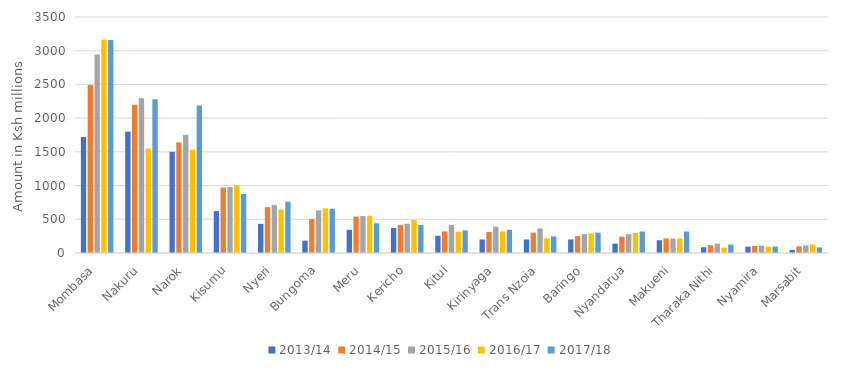
| Category | 2013/14 | 2014/15 | 2015/16 | 2016/17 | 2017/18  |
|---|---|---|---|---|---|
| Mombasa | 1720 | 2492.6 | 2943.521 | 3166.241 | 3159.156 |
| Nakuru | 1800 | 2200.28 | 2295.463 | 1548.295 | 2278.646 |
| Narok | 1500 | 1639.206 | 1752.938 | 1533.934 | 2188.437 |
| Kisumu | 621.9 | 970.903 | 978.889 | 1004.044 | 874.902 |
| Nyeri | 432.2 | 680.7 | 709.554 | 643.139 | 760.226 |
| Bungoma | 182.7 | 504.624 | 630.988 | 661.588 | 656.75 |
| Meru | 344 | 539.24 | 548.289 | 552.668 | 441.691 |
| Kericho | 371 | 413.581 | 434.405 | 489.981 | 414.049 |
| Kitui | 255.2 | 320.521 | 416.189 | 315.347 | 335.122 |
| Kirinyaga | 200.4 | 311.635 | 390.377 | 320.638 | 343.97 |
| Trans Nzoia | 201.7 | 301.267 | 364.97 | 217.894 | 246.063 |
| Baringo | 201.5 | 249.723 | 279.317 | 288.519 | 301.404 |
| Nyandarua | 138.4 | 240.629 | 279.226 | 296.767 | 318.586 |
| Makueni | 189.2 | 215.35 | 213.171 | 216.258 | 319.282 |
| Tharaka Nithi | 85.4 | 115.73 | 139.13 | 78.569 | 126.607 |
| Nyamira | 94 | 104.255 | 106.982 | 93.92 | 96.617 |
| Marsabit | 46 | 99.107 | 111.943 | 128.73 | 83.39 |